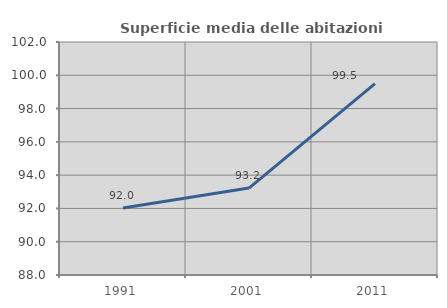
| Category | Superficie media delle abitazioni occupate |
|---|---|
| 1991.0 | 92.023 |
| 2001.0 | 93.222 |
| 2011.0 | 99.499 |